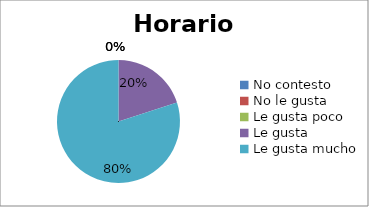
| Category | Series 0 |
|---|---|
| No contesto | 0 |
| No le gusta | 0 |
| Le gusta poco | 0 |
| Le gusta | 1 |
| Le gusta mucho | 4 |